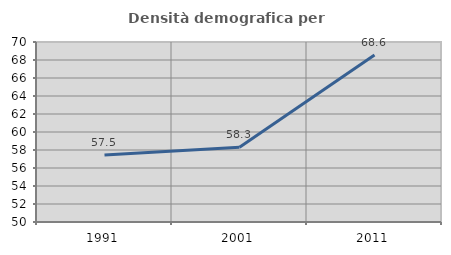
| Category | Densità demografica |
|---|---|
| 1991.0 | 57.451 |
| 2001.0 | 58.305 |
| 2011.0 | 68.552 |